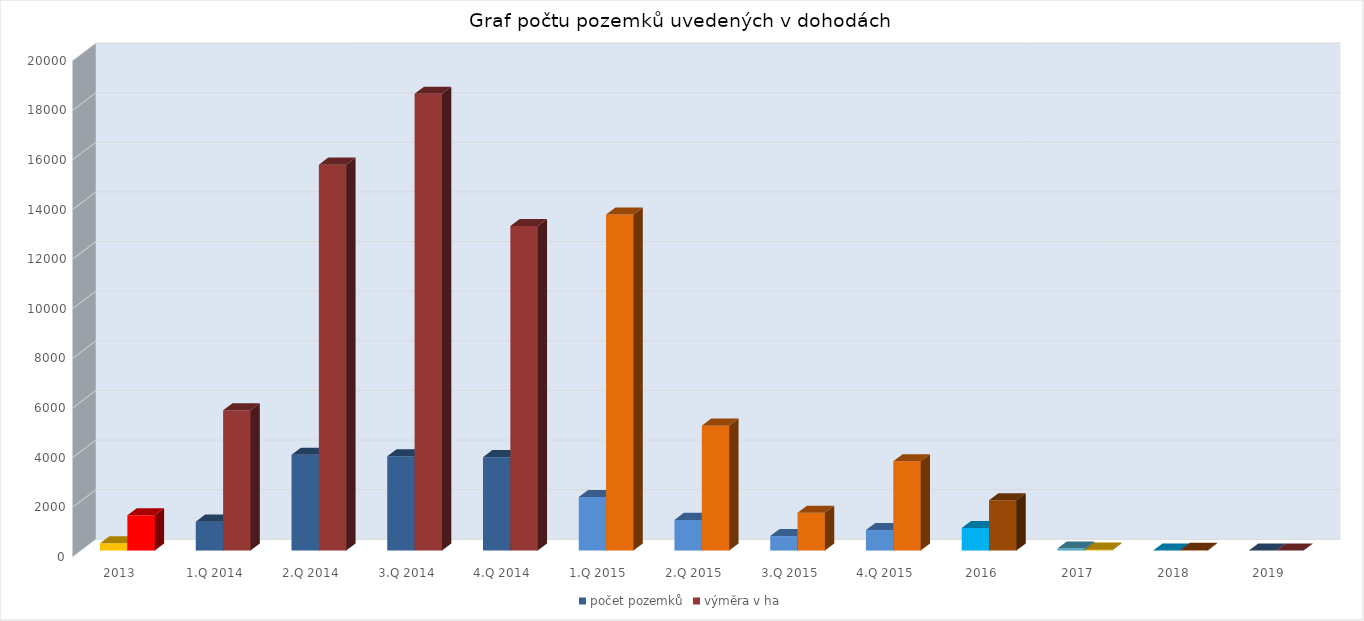
| Category | počet pozemků | výměra v ha |
|---|---|---|
| 2013 | 293 | 1422 |
| 1.Q 2014 | 1164 | 5651 |
| 2.Q 2014 | 3860 | 15549 |
| 3.Q 2014 | 3800 | 18406 |
| 4.Q 2014 | 3763 | 13077 |
| 1.Q 2015 | 2154 | 13537 |
| 2.Q 2015 | 1234 | 5032 |
| 3.Q 2015 | 583 | 1518 |
| 4.Q 2015 | 826 | 3597 |
| 2016 | 907 | 2027 |
| 2017 | 78 | 35 |
| 2018 | 2 | 25 |
| 2019 | 0 | 0 |